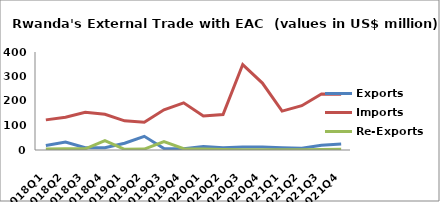
| Category | Exports | Imports | Re-Exports |
|---|---|---|---|
| 2018Q1 | 18.608 | 122.951 | 4.57 |
| 2018Q2 | 32.909 | 133.823 | 4.622 |
| 2018Q3 | 9.064 | 153.831 | 4.747 |
| 2018Q4 | 8.931 | 145.657 | 38.097 |
| 2019Q1 | 27.532 | 118.895 | 2.571 |
| 2019Q2 | 55.968 | 113.561 | 3.654 |
| 2019Q3 | 6.192 | 164.3 | 34.329 |
| 2019Q4 | 5.149 | 192.569 | 5.268 |
| 2020Q1 | 14.209 | 138.663 | 3.748 |
| 2020Q2 | 8.786 | 144.885 | 1.712 |
| 2020Q3 | 11.767 | 348.723 | 1.141 |
| 2020Q4 | 12.136 | 273.335 | 0.92 |
| 2021Q1 | 9.302 | 158.626 | 0.693 |
| 2021Q2 | 7.396 | 180.858 | 1.076 |
| 2021Q3 | 19.208 | 228.408 | 2.214 |
| 2021Q4 | 24.275 | 227.083 | 3.044 |